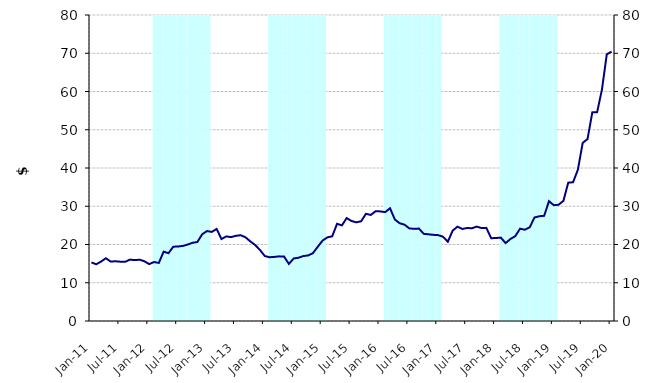
| Category | Series 1 |
|---|---|
| 0 | 0 |
| 1900-01-01 | 0 |
| 1900-01-02 | 0 |
| 1900-01-03 | 0 |
| 1900-01-04 | 0 |
| 1900-01-05 | 0 |
| 1900-01-06 | 0 |
| 1900-01-07 | 0 |
| 1900-01-08 | 0 |
| 1900-01-09 | 0 |
| 1900-01-10 | 0 |
| 1900-01-11 | 0 |
| 1900-01-12 | 0 |
| 1900-01-13 | 80000000 |
| 1900-01-14 | 80000000 |
| 1900-01-15 | 80000000 |
| 1900-01-16 | 80000000 |
| 1900-01-17 | 80000000 |
| 1900-01-18 | 80000000 |
| 1900-01-19 | 80000000 |
| 1900-01-20 | 80000000 |
| 1900-01-21 | 80000000 |
| 1900-01-22 | 80000000 |
| 1900-01-23 | 80000000 |
| 1900-01-24 | 80000000 |
| 1900-01-25 | 0 |
| 1900-01-26 | 0 |
| 1900-01-27 | 0 |
| 1900-01-28 | 0 |
| 1900-01-29 | 0 |
| 1900-01-30 | 0 |
| 1900-01-31 | 0 |
| 1900-02-01 | 0 |
| 1900-02-02 | 0 |
| 1900-02-03 | 0 |
| 1900-02-04 | 0 |
| 1900-02-05 | 0 |
| 1900-02-06 | 80000000 |
| 1900-02-07 | 80000000 |
| 1900-02-08 | 80000000 |
| 1900-02-09 | 80000000 |
| 1900-02-10 | 80000000 |
| 1900-02-11 | 80000000 |
| 1900-02-12 | 80000000 |
| 1900-02-13 | 80000000 |
| 1900-02-14 | 80000000 |
| 1900-02-15 | 80000000 |
| 1900-02-16 | 80000000 |
| 1900-02-17 | 80000000 |
| 1900-02-18 | 0 |
| 1900-02-19 | 0 |
| 1900-02-20 | 0 |
| 1900-02-21 | 0 |
| 1900-02-22 | 0 |
| 1900-02-23 | 0 |
| 1900-02-24 | 0 |
| 1900-02-25 | 0 |
| 1900-02-26 | 0 |
| 1900-02-27 | 0 |
| 1900-02-28 | 0 |
| 1900-02-28 | 0 |
| 1900-03-01 | 80000000 |
| 1900-03-02 | 80000000 |
| 1900-03-03 | 80000000 |
| 1900-03-04 | 80000000 |
| 1900-03-05 | 80000000 |
| 1900-03-06 | 80000000 |
| 1900-03-07 | 80000000 |
| 1900-03-08 | 80000000 |
| 1900-03-09 | 80000000 |
| 1900-03-10 | 80000000 |
| 1900-03-11 | 80000000 |
| 1900-03-12 | 80000000 |
| 1900-03-13 | 0 |
| 1900-03-14 | 0 |
| 1900-03-15 | 0 |
| 1900-03-16 | 0 |
| 1900-03-17 | 0 |
| 1900-03-18 | 0 |
| 1900-03-19 | 0 |
| 1900-03-20 | 0 |
| 1900-03-21 | 0 |
| 1900-03-22 | 0 |
| 1900-03-23 | 0 |
| 1900-03-24 | 0 |
| 1900-03-25 | 80000000 |
| 1900-03-26 | 80000000 |
| 1900-03-27 | 80000000 |
| 1900-03-28 | 80000000 |
| 1900-03-29 | 80000000 |
| 1900-03-30 | 80000000 |
| 1900-03-31 | 80000000 |
| 1900-04-01 | 80000000 |
| 1900-04-02 | 80000000 |
| 1900-04-03 | 80000000 |
| 1900-04-04 | 80000000 |
| 1900-04-05 | 80000000 |
| 1900-04-06 | 0 |
| 1900-04-07 | 0 |
| 1900-04-08 | 0 |
| 1900-04-09 | 0 |
| 1900-04-10 | 0 |
| 1900-04-11 | 0 |
| 1900-04-12 | 0 |
| 1900-04-13 | 0 |
| 1900-04-14 | 0 |
| 1900-04-15 | 0 |
| 1900-04-16 | 0 |
| 1900-04-17 | 0 |